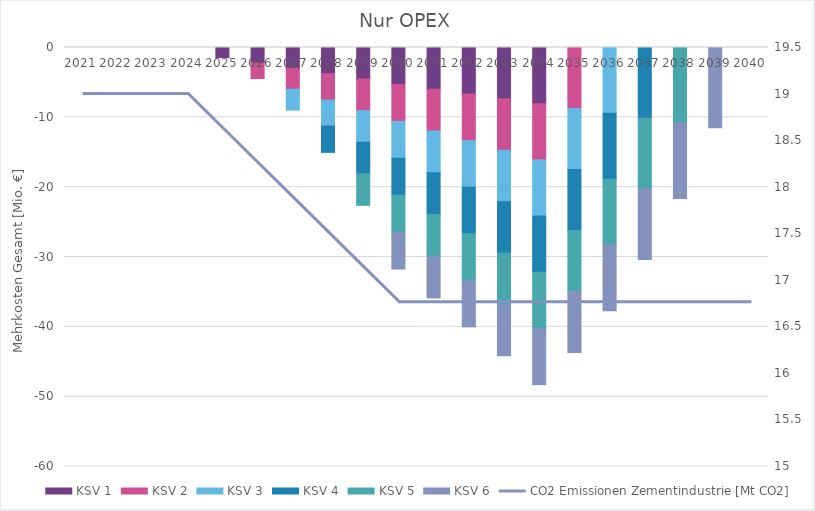
| Category | KSV 1 | KSV 2 | KSV 3 | KSV 4 | KSV 5 | KSV 6 |
|---|---|---|---|---|---|---|
| 0 | 0 | 0 | 0 | 0 | 0 | 0 |
| 1 | 0 | 0 | 0 | 0 | 0 | 0 |
| 2 | 0 | 0 | 0 | 0 | 0 | 0 |
| 3 | 0 | 0 | 0 | 0 | 0 | 0 |
| 4 | -1.454 | 0 | 0 | 0 | 0 | 0 |
| 5 | -2.221 | -2.221 | 0 | 0 | 0 | 0 |
| 6 | -2.987 | -2.987 | -2.987 | 0 | 0 | 0 |
| 7 | -3.754 | -3.754 | -3.754 | -3.754 | 0 | 0 |
| 8 | -4.521 | -4.521 | -4.521 | -4.521 | -4.521 | 0 |
| 9 | -5.287 | -5.287 | -5.287 | -5.287 | -5.287 | -5.287 |
| 10 | -5.977 | -5.977 | -5.977 | -5.977 | -5.977 | -5.977 |
| 11 | -6.667 | -6.667 | -6.667 | -6.667 | -6.667 | -6.667 |
| 12 | -7.357 | -7.357 | -7.357 | -7.357 | -7.357 | -7.357 |
| 13 | -8.047 | -8.047 | -8.047 | -8.047 | -8.047 | -8.047 |
| 14 | 0 | -8.737 | -8.737 | -8.737 | -8.737 | -8.737 |
| 15 | 0 | 0 | -9.427 | -9.427 | -9.427 | -9.427 |
| 16 | 0 | 0 | 0 | -10.117 | -10.117 | -10.117 |
| 17 | 0 | 0 | 0 | 0 | -10.807 | -10.807 |
| 18 | 0 | 0 | 0 | 0 | 0 | -11.497 |
| 19 | 0 | 0 | 0 | 0 | 0 | 0 |